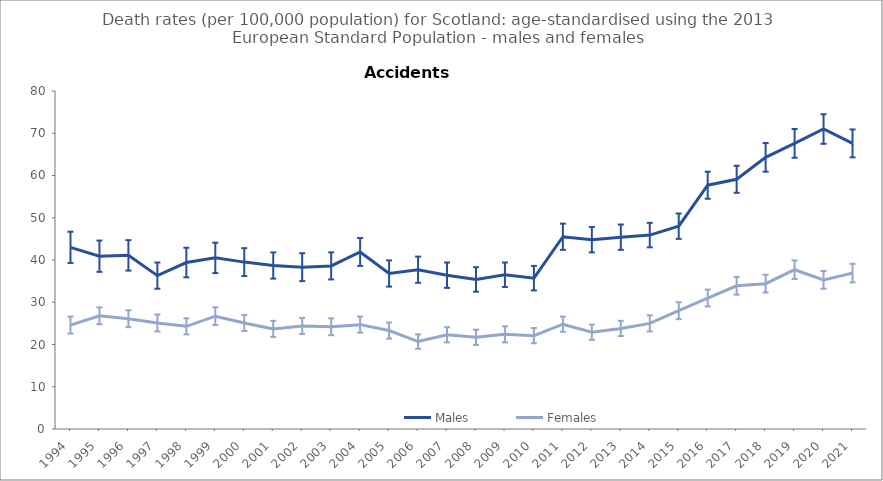
| Category | Males | Females |
|---|---|---|
| 1994.0 | 43 | 24.6 |
| 1995.0 | 40.9 | 26.8 |
| 1996.0 | 41.1 | 26.1 |
| 1997.0 | 36.3 | 25.1 |
| 1998.0 | 39.4 | 24.3 |
| 1999.0 | 40.5 | 26.7 |
| 2000.0 | 39.5 | 25.1 |
| 2001.0 | 38.7 | 23.7 |
| 2002.0 | 38.3 | 24.4 |
| 2003.0 | 38.6 | 24.2 |
| 2004.0 | 41.9 | 24.7 |
| 2005.0 | 36.8 | 23.3 |
| 2006.0 | 37.7 | 20.7 |
| 2007.0 | 36.4 | 22.3 |
| 2008.0 | 35.4 | 21.7 |
| 2009.0 | 36.5 | 22.4 |
| 2010.0 | 35.7 | 22.1 |
| 2011.0 | 45.5 | 24.8 |
| 2012.0 | 44.8 | 22.9 |
| 2013.0 | 45.4 | 23.8 |
| 2014.0 | 45.9 | 25 |
| 2015.0 | 48 | 28 |
| 2016.0 | 57.7 | 31 |
| 2017.0 | 59.1 | 33.9 |
| 2018.0 | 64.3 | 34.4 |
| 2019.0 | 67.6 | 37.7 |
| 2020.0 | 71 | 35.3 |
| 2021.0 | 67.6 | 36.9 |